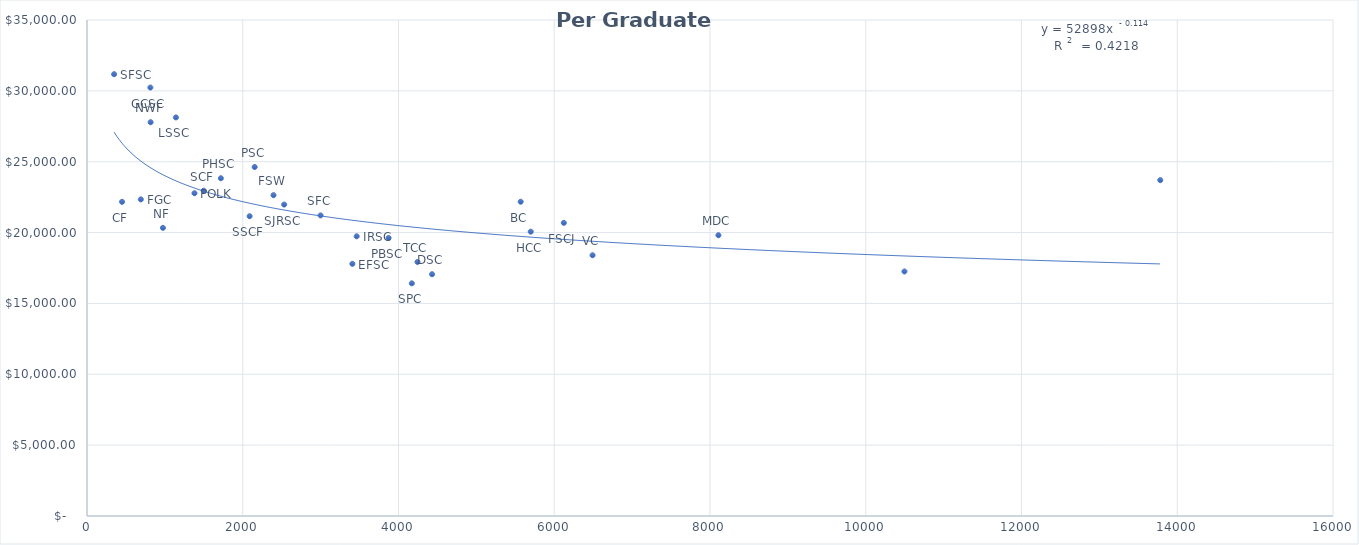
| Category | Per Graduate Funds  |
|---|---|
| 348.0 | 31176.373 |
| 691.0 | 22341.019 |
| 814.0 | 30234.551 |
| 975.0 | 20332.067 |
| 1142.0 | 28126.095 |
| 450.0 | 22168.146 |
| 817.0 | 27786.685 |
| 1719.0 | 23833.82 |
| 1380.0 | 22775.988 |
| 2153.0 | 24626.721 |
| 2532.0 | 21977.68 |
| 2395.0 | 22638.47 |
| 1499.0 | 22956.222 |
| 2999.0 | 21210.688 |
| 2088.0 | 21153.81 |
| 3463.0 | 19736.73 |
| 4244.0 | 17925.623 |
| 4431.0 | 17060.343 |
| 3408.0 | 17795.434 |
| 3873.0 | 19621.777 |
| 4171.0 | 16418.896 |
| 5698.0 | 20062.729 |
| 6123.0 | 20684.757 |
| 5569.0 | 22176.192 |
| 6492.0 | 18398.648 |
| 8108.0 | 19813.156 |
| 10497.0 | 17255.535 |
| 13782.0 | 23698.908 |